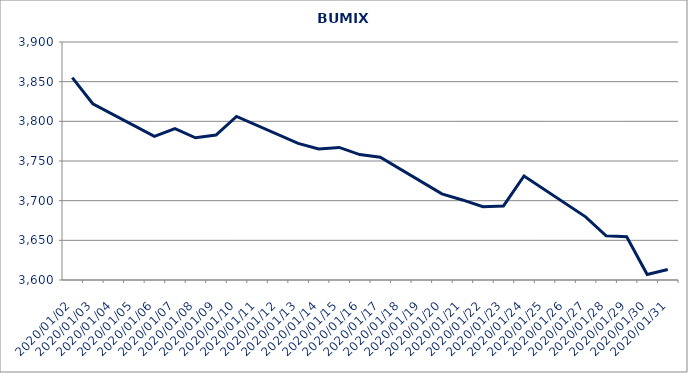
| Category | BUMIX |
|---|---|
| 2020-01-02 | 3855.153 |
| 2020-01-03 | 3822.201 |
| 2020-01-06 | 3781.099 |
| 2020-01-07 | 3790.856 |
| 2020-01-08 | 3779.276 |
| 2020-01-09 | 3782.647 |
| 2020-01-10 | 3806.144 |
| 2020-01-13 | 3772.265 |
| 2020-01-14 | 3765.275 |
| 2020-01-15 | 3767.076 |
| 2020-01-16 | 3758.111 |
| 2020-01-17 | 3754.828 |
| 2020-01-20 | 3708.525 |
| 2020-01-21 | 3700.916 |
| 2020-01-22 | 3692.374 |
| 2020-01-23 | 3693.346 |
| 2020-01-24 | 3731.112 |
| 2020-01-27 | 3679.585 |
| 2020-01-28 | 3655.642 |
| 2020-01-29 | 3654.49 |
| 2020-01-30 | 3607.044 |
| 2020-01-31 | 3613.339 |